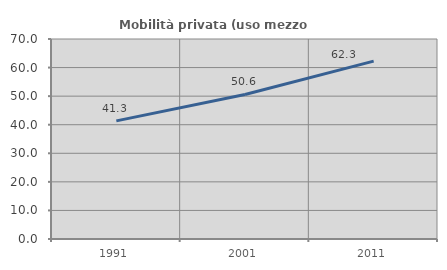
| Category | Mobilità privata (uso mezzo privato) |
|---|---|
| 1991.0 | 41.337 |
| 2001.0 | 50.581 |
| 2011.0 | 62.26 |